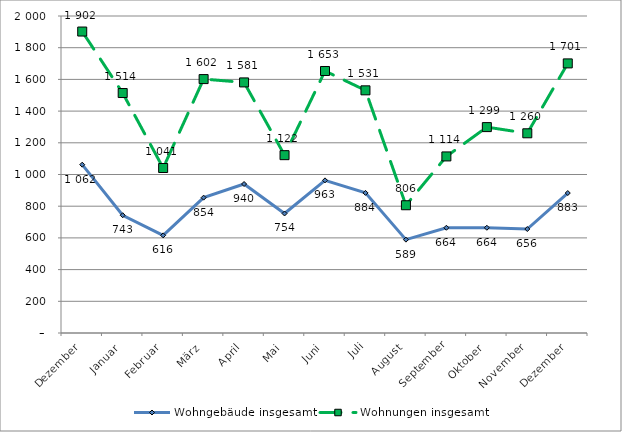
| Category | Wohngebäude insgesamt | Wohnungen insgesamt |
|---|---|---|
| Dezember | 1062 | 1902 |
| Januar | 743 | 1514 |
| Februar | 616 | 1041 |
| März | 854 | 1602 |
| April | 940 | 1581 |
| Mai | 754 | 1122 |
| Juni | 963 | 1653 |
| Juli | 884 | 1531 |
| August | 589 | 806 |
| September | 664 | 1114 |
| Oktober | 664 | 1299 |
| November | 656 | 1260 |
| Dezember | 883 | 1701 |